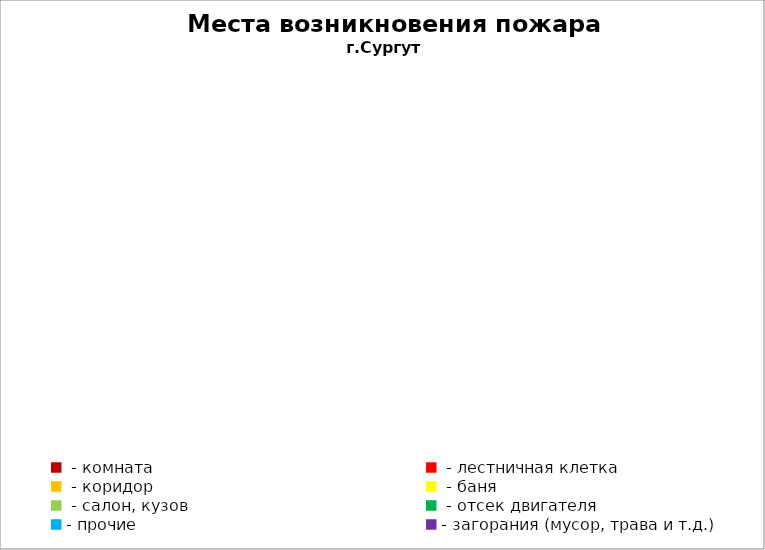
| Category | Места возникновения пожара |
|---|---|
|  - комната | 29 |
|  - лестничная клетка | 11 |
|  - коридор | 4 |
|  - баня | 10 |
|  - салон, кузов | 4 |
|  - отсек двигателя | 10 |
| - прочие | 46 |
| - загорания (мусор, трава и т.д.)  | 42 |